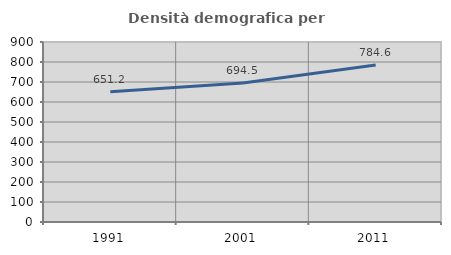
| Category | Densità demografica |
|---|---|
| 1991.0 | 651.21 |
| 2001.0 | 694.478 |
| 2011.0 | 784.554 |